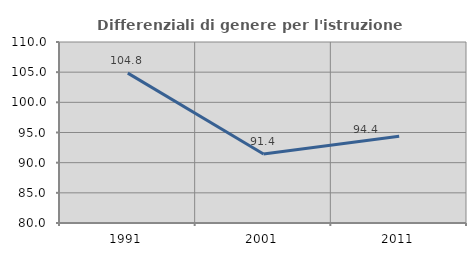
| Category | Differenziali di genere per l'istruzione superiore |
|---|---|
| 1991.0 | 104.841 |
| 2001.0 | 91.423 |
| 2011.0 | 94.382 |